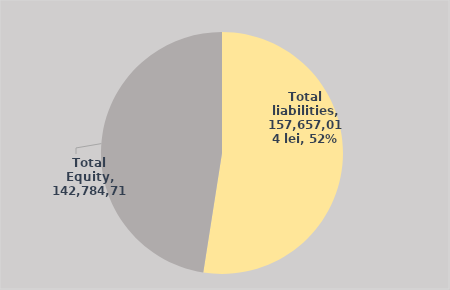
| Category | Series 0 |
|---|---|
| Total liabilities | 157657014.433 |
| Total Equity | 142784719.076 |